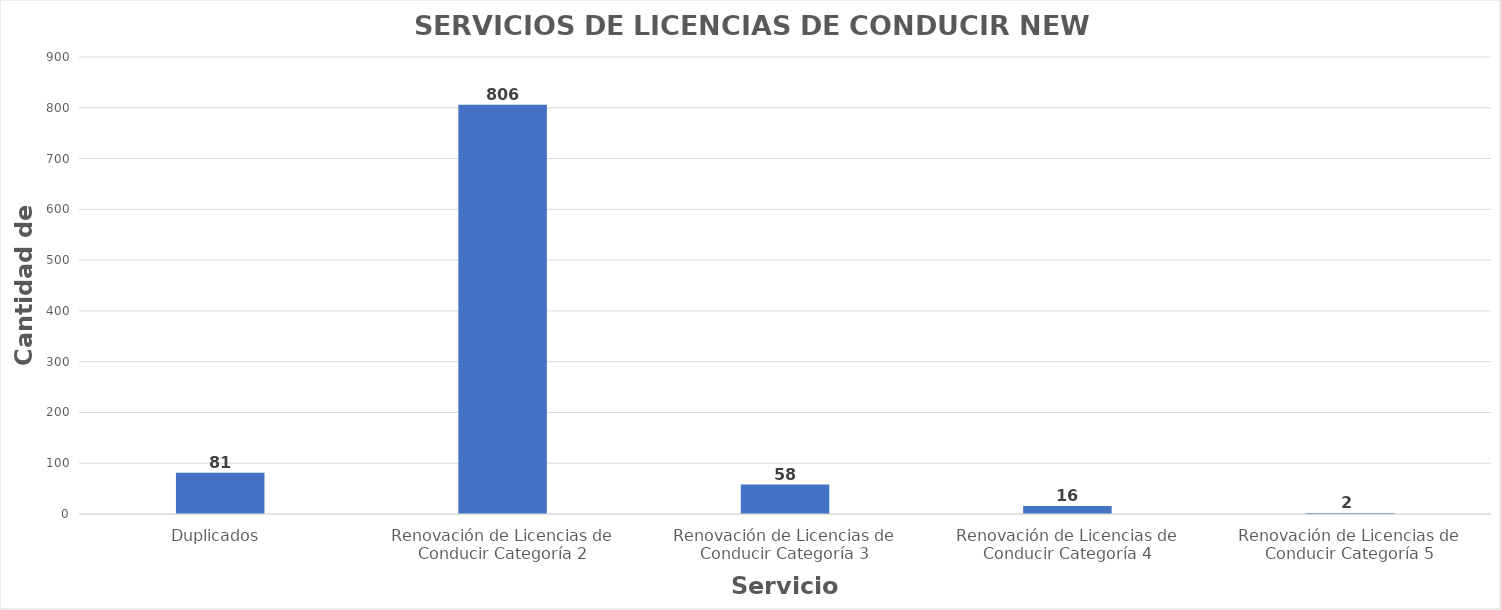
| Category | Series 0 |
|---|---|
| Duplicados  | 81 |
| Renovación de Licencias de Conducir Categoría 2 | 806 |
| Renovación de Licencias de Conducir Categoría 3 | 58 |
| Renovación de Licencias de Conducir Categoría 4 | 16 |
| Renovación de Licencias de Conducir Categoría 5 | 2 |